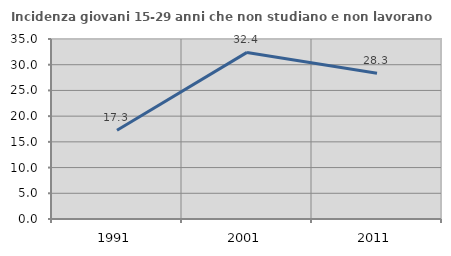
| Category | Incidenza giovani 15-29 anni che non studiano e non lavorano  |
|---|---|
| 1991.0 | 17.252 |
| 2001.0 | 32.394 |
| 2011.0 | 28.333 |